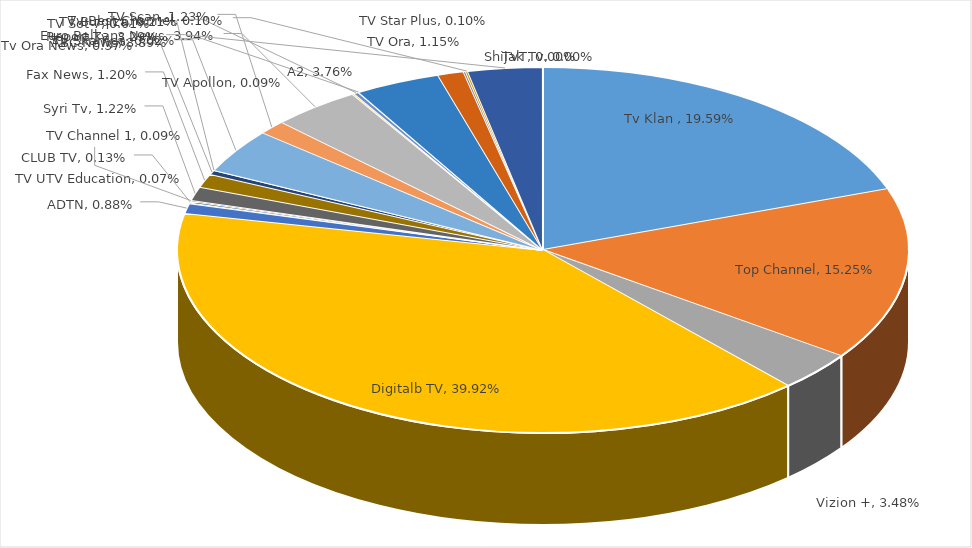
| Category | Series 0 |
|---|---|
| Tv Klan  | 0.196 |
| Top Channel | 0.152 |
| Vizion + | 0.035 |
| Digitalb TV | 0.399 |
| ADTN | 0.009 |
| TV UTV Education | 0.001 |
| CLUB TV | 0.001 |
| TV Channel 1 | 0.001 |
| Syri Tv | 0.012 |
| Fax News | 0.012 |
| Tv Ora News | 0.004 |
| TV Sot 7 | 0 |
| ABC News | 0.039 |
| TV Scan | 0.012 |
| Euro Balkans News | 0.039 |
| TV Apollon | 0.001 |
| TV Bulqiza | 0.002 |
| TV Skampa | 0 |
| A2 | 0.038 |
| TV Ora | 0.012 |
| TV Star Plus | 0.001 |
| Tv Best Channel | 0.001 |
| Report Tv | 0.033 |
| Shijak Tv | 0 |
| TVT | 0 |